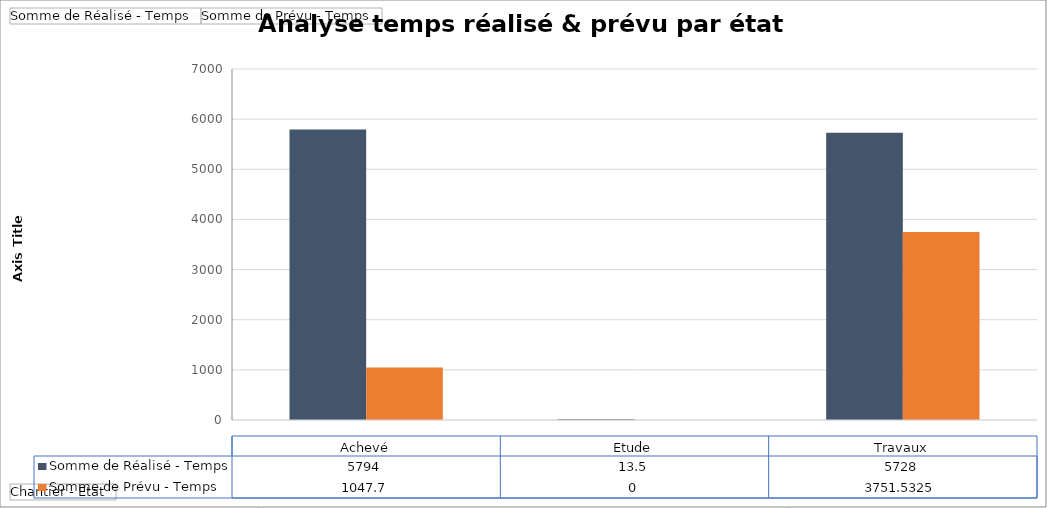
| Category | Somme de Réalisé - Temps | Somme de Prévu - Temps |
|---|---|---|
| Achevé | 5794 | 1047.7 |
| Etude | 13.5 | 0 |
| Travaux | 5728 | 3751.532 |